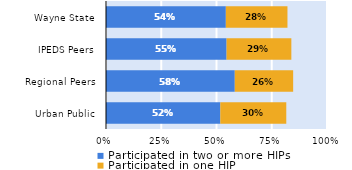
| Category | Participated in two or more HIPs | Participated in one HIP |
|---|---|---|
| Urban Public | 0.517 | 0.299 |
| Regional Peers | 0.583 | 0.264 |
| IPEDS Peers | 0.546 | 0.293 |
| Wayne State | 0.542 | 0.279 |